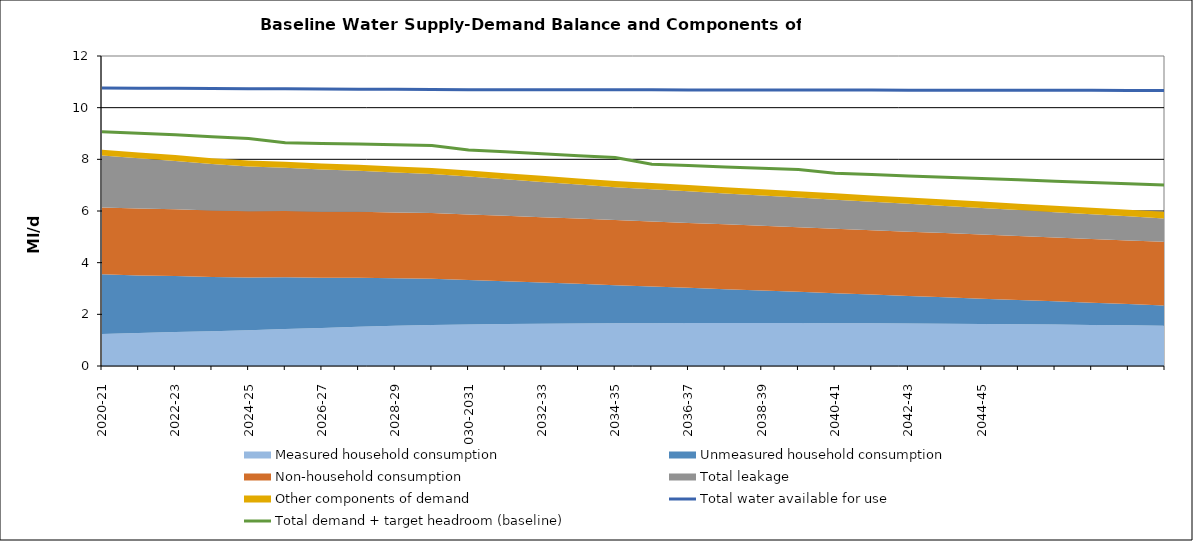
| Category | Total water available for use | Total demand + target headroom (baseline) |
|---|---|---|
| 0 | 10.762 | 9.07 |
| 1 | 10.756 | 9.005 |
| 2 | 10.749 | 8.948 |
| 3 | 10.743 | 8.872 |
| 4 | 10.736 | 8.805 |
| 5 | 10.729 | 8.64 |
| 6 | 10.723 | 8.609 |
| 7 | 10.716 | 8.593 |
| 8 | 10.709 | 8.564 |
| 9 | 10.703 | 8.536 |
| 10 | 10.698 | 8.36 |
| 11 | 10.696 | 8.29 |
| 12 | 10.694 | 8.213 |
| 13 | 10.693 | 8.142 |
| 14 | 10.691 | 8.07 |
| 15 | 10.689 | 7.812 |
| 16 | 10.688 | 7.758 |
| 17 | 10.686 | 7.707 |
| 18 | 10.684 | 7.656 |
| 19 | 10.683 | 7.604 |
| 20 | 10.681 | 7.461 |
| 21 | 10.679 | 7.412 |
| 22 | 10.678 | 7.359 |
| 23 | 10.676 | 7.308 |
| 24 | 10.675 | 7.263 |
| 25 | 10.673 | 7.207 |
| 26 | 10.671 | 7.155 |
| 27 | 10.67 | 7.103 |
| 28 | 10.668 | 7.056 |
| 29 | 10.666 | 7.003 |